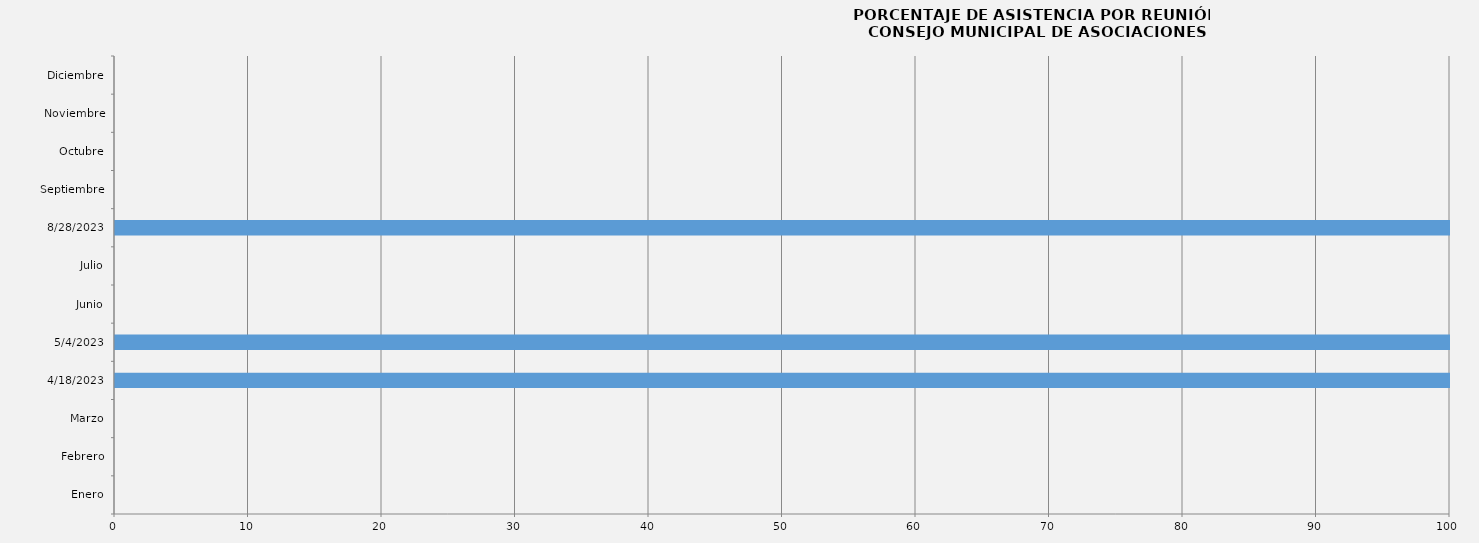
| Category | Enero |
|---|---|
| Enero | 0 |
| Febrero | 0 |
| Marzo | 0 |
| 18/04/2023 | 100 |
| 04/05/2023 | 100 |
| Junio | 0 |
| Julio | 0 |
| 28/08/2023 | 100 |
| Septiembre | 0 |
| Octubre | 0 |
| Noviembre | 0 |
| Diciembre | 0 |